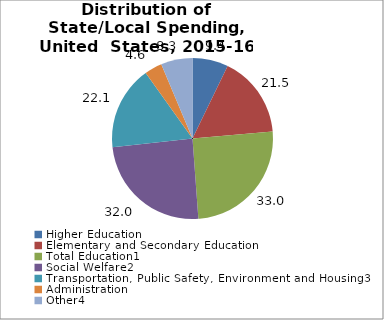
| Category | Series 0 |
|---|---|
| Higher Education | 9.417 |
| Elementary and Secondary Education | 21.46 |
| Total Education1 | 33.038 |
| Social Welfare2 | 31.962 |
| Transportation, Public Safety, Environment and Housing3 | 22.079 |
| Administration | 4.626 |
| Other4 | 8.295 |